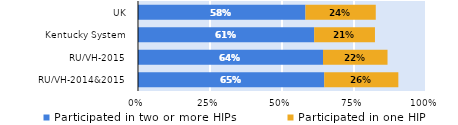
| Category | Participated in two or more HIPs | Participated in one HIP |
|---|---|---|
| RU/VH-2014&2015 | 0.647 | 0.257 |
| RU/VH-2015 | 0.642 | 0.224 |
| Kentucky System | 0.612 | 0.211 |
| UK | 0.581 | 0.244 |